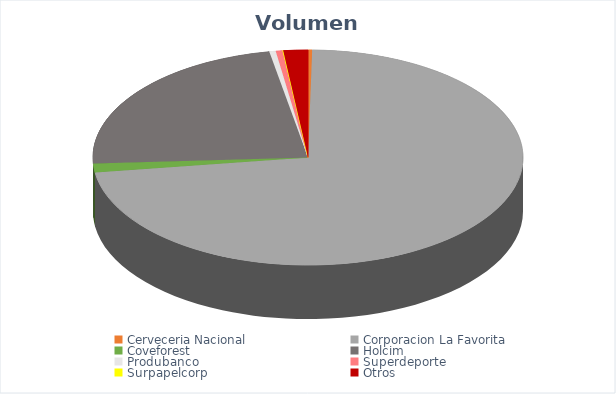
| Category | VOLUMEN ($USD) |
|---|---|
| Cerveceria Nacional | 450 |
| Corporacion La Favorita | 105632.21 |
| Coveforest | 2002 |
| Holcim | 33530 |
| Produbanco | 709.77 |
| Superdeporte | 726 |
| Surpapelcorp | 85 |
| Otros | 2676 |